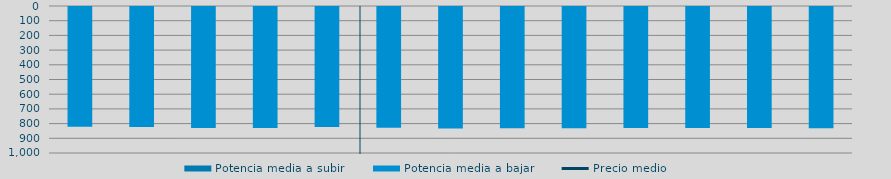
| Category | Potencia media a subir | Potencia media a bajar |
|---|---|---|
| 0 |  | 814.726 |
| 1 |  | 815.741 |
| 2 |  | 822.445 |
| 3 |  | 823.829 |
| 4 |  | 816.372 |
| 5 |  | 821.408 |
| 6 |  | 825.952 |
| 7 |  | 824.183 |
| 8 |  | 824.381 |
| 9 |  | 823.337 |
| 10 |  | 823.521 |
| 11 |  | 823.928 |
| 12 |  | 824.328 |